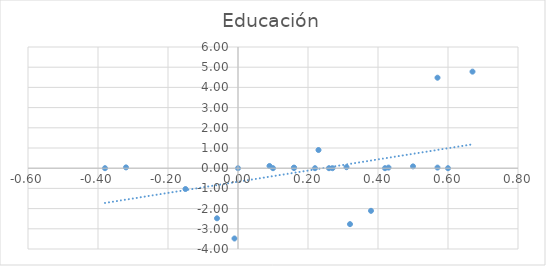
| Category | Educación |
|---|---|
| 0.38 | -2.11 |
| -0.15 | -1.03 |
| -0.06 | -2.48 |
| 0.32 | -2.77 |
| -0.01 | -3.48 |
| 0.0 | 0 |
| -0.38 | 0 |
| -0.32 | 0.04 |
| 0.16 | 0.01 |
| 0.57 | 0.03 |
| 0.67 | 4.78 |
| 0.42 | 0 |
| 0.26 | 0 |
| 0.1 | 0 |
| 0.16 | 0.03 |
| 0.23 | 0.9 |
| 0.09 | 0.11 |
| 0.22 | 0 |
| 0.27 | 0 |
| 0.31 | 0.05 |
| 0.5 | 0.09 |
| 0.43 | 0.03 |
| 0.57 | 4.48 |
| 0.6 | 0 |